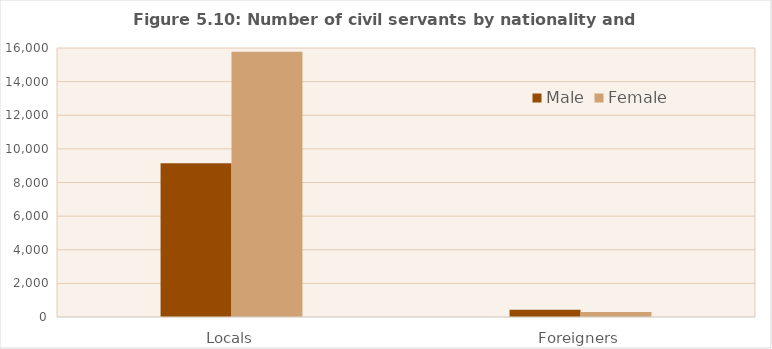
| Category | Male | Female |
|---|---|---|
| Locals | 9143 | 15781 |
| Foreigners | 430 | 298 |